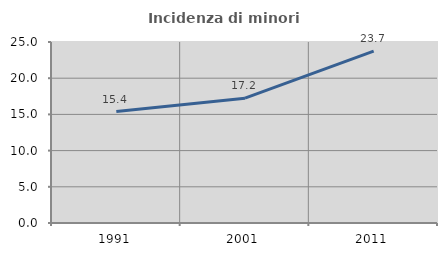
| Category | Incidenza di minori stranieri |
|---|---|
| 1991.0 | 15.385 |
| 2001.0 | 17.241 |
| 2011.0 | 23.737 |